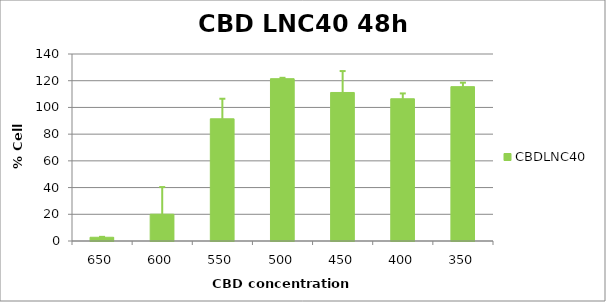
| Category | CBDLNC40 |
|---|---|
| 650.0 | 2.806 |
| 600.0 | 20.073 |
| 550.0 | 91.482 |
| 500.0 | 121.518 |
| 450.0 | 111.189 |
| 400.0 | 106.48 |
| 350.0 | 115.56 |